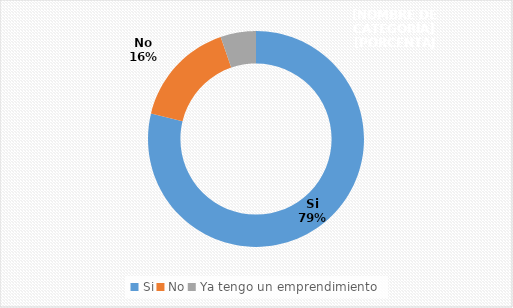
| Category | Series 0 |
|---|---|
| Si | 0.788 |
| No | 0.159 |
| Ya tengo un emprendimiento | 0.053 |